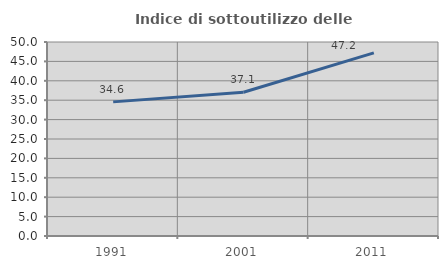
| Category | Indice di sottoutilizzo delle abitazioni  |
|---|---|
| 1991.0 | 34.568 |
| 2001.0 | 37.052 |
| 2011.0 | 47.191 |